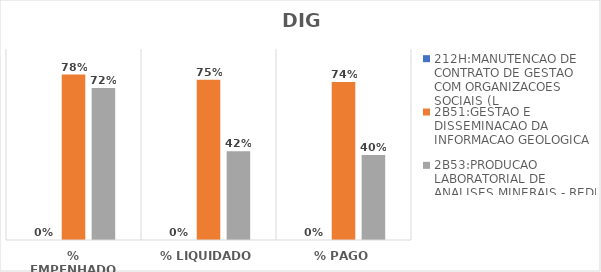
| Category | 212H:MANUTENCAO DE CONTRATO DE GESTAO COM ORGANIZACOES SOCIAIS (L | 2B51:GESTAO E DISSEMINACAO DA INFORMACAO GEOLOGICA | 2B53:PRODUCAO LABORATORIAL DE ANALISES MINERAIS - REDE LAMIN |
|---|---|---|---|
| % EMPENHADO | 0 | 0.779 | 0.716 |
| % LIQUIDADO | 0 | 0.755 | 0.418 |
| % PAGO | 0 | 0.744 | 0.4 |